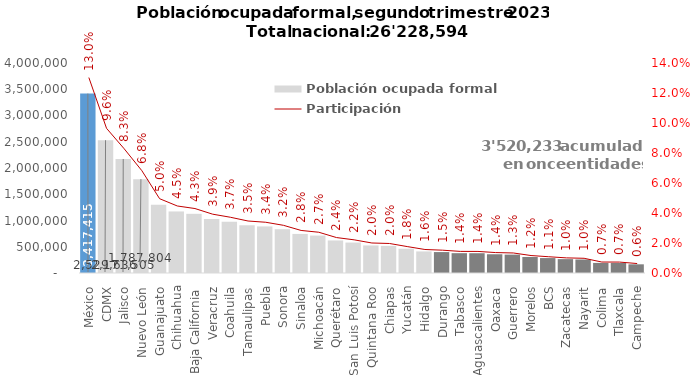
| Category | Población ocupada formal |
|---|---|
| México | 3417415 |
| CDMX | 2529636 |
| Jalisco | 2171505 |
| Nuevo León | 1787804 |
| Guanajuato | 1299250 |
| Chihuahua | 1172005 |
| Baja California | 1127099 |
| Veracruz | 1028383 |
| Coahuila | 974946 |
| Tamaulipas | 909015 |
| Puebla | 887218 |
| Sonora | 833931 |
| Sinaloa | 744011 |
| Michoacán | 712816 |
| Querétaro | 619778 |
| San Luis Potosí | 579958 |
| Quintana Roo | 524603 |
| Chiapas | 515941 |
| Yucatán | 462041 |
| Hidalgo | 411006 |
| Durango | 398725 |
| Tabasco | 377688 |
| Aguascalientes | 377071 |
| Oaxaca | 357123 |
| Guerrero | 349993 |
| Morelos | 305361 |
| BCS | 284349 |
| Zacatecas | 264311 |
| Nayarit | 257240 |
| Colima | 191863 |
| Tlaxcala | 191078 |
| Campeche | 165431 |